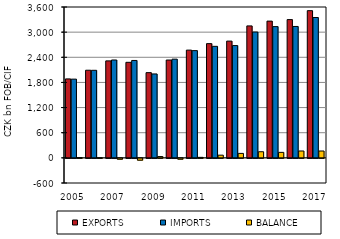
| Category | EXPORTS | IMPORTS | BALANCE |
|---|---|---|---|
| 2005.0 | 1883.79 | 1878.625 | 5.165 |
| 2006.0 | 2091.052 | 2089.252 | 1.8 |
| 2007.0 | 2314.157 | 2335.398 | -21.241 |
| 2008.0 | 2279.85 | 2324.182 | -44.332 |
| 2009.0 | 2033.354 | 2002.287 | 31.067 |
| 2010.0 | 2334.842 | 2355.421 | -20.579 |
| 2011.0 | 2570.941 | 2558.964 | 11.977 |
| 2012.0 | 2725.844 | 2661.432 | 64.412 |
| 2013.0 | 2786.229 | 2679.71 | 106.518 |
| 2014.0 | 3149.196 | 3003.188 | 146.008 |
| 2015.0 | 3262.971 | 3131.994 | 130.977 |
| 2016.0 | 3299.106 | 3135.452 | 163.654 |
| 2017.0 | 3512.897 | 3349.431 | 163.466 |